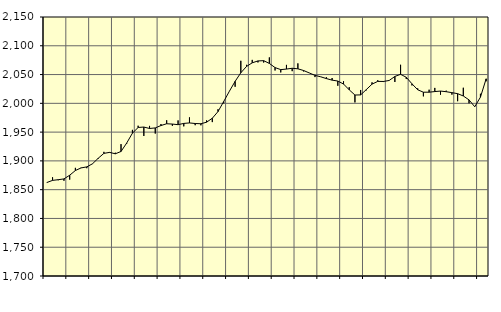
| Category | Piggar | Series 1 |
|---|---|---|
| nan | 1862.1 | 1862.42 |
| 1.0 | 1871.5 | 1866.12 |
| 1.0 | 1866.4 | 1867.33 |
| 1.0 | 1865.5 | 1868.67 |
| nan | 1867.5 | 1875.08 |
| 2.0 | 1887.9 | 1883.27 |
| 2.0 | 1888.2 | 1887.79 |
| 2.0 | 1887.3 | 1889.59 |
| nan | 1894.6 | 1894.94 |
| 3.0 | 1903.5 | 1904.54 |
| 3.0 | 1915.7 | 1913.06 |
| 3.0 | 1915.4 | 1914.78 |
| nan | 1914.2 | 1912.31 |
| 4.0 | 1929.1 | 1916.35 |
| 4.0 | 1930 | 1931.1 |
| 4.0 | 1953.9 | 1948.16 |
| nan | 1961.1 | 1958.06 |
| 5.0 | 1943.3 | 1958.8 |
| 5.0 | 1960.8 | 1956.31 |
| 5.0 | 1947.5 | 1957.27 |
| nan | 1964 | 1961.42 |
| 6.0 | 1970.6 | 1964.5 |
| 6.0 | 1960.9 | 1963.97 |
| 6.0 | 1970.3 | 1962.91 |
| nan | 1960 | 1965.12 |
| 7.0 | 1975.6 | 1965.96 |
| 7.0 | 1962 | 1964.94 |
| 7.0 | 1961.8 | 1964.55 |
| nan | 1970.4 | 1967.24 |
| 8.0 | 1967.4 | 1974.1 |
| 8.0 | 1989.7 | 1985.68 |
| 8.0 | 2000 | 2003.14 |
| nan | 2021 | 2021.08 |
| 9.0 | 2028.8 | 2038.2 |
| 9.0 | 2073.9 | 2053.06 |
| 9.0 | 2066.9 | 2064.12 |
| nan | 2075.5 | 2070.4 |
| 10.0 | 2071.1 | 2073.68 |
| 10.0 | 2070.9 | 2074.13 |
| 10.0 | 2079.8 | 2069.34 |
| nan | 2057.1 | 2062.11 |
| 11.0 | 2053.7 | 2058.58 |
| 11.0 | 2066.8 | 2059.53 |
| 11.0 | 2055.9 | 2060.95 |
| nan | 2069.4 | 2059.96 |
| 12.0 | 2055.4 | 2057.03 |
| 12.0 | 2052.9 | 2052.78 |
| 12.0 | 2045.6 | 2048.58 |
| nan | 2046 | 2046.13 |
| 13.0 | 2045.3 | 2043 |
| 13.0 | 2044 | 2040.29 |
| 13.0 | 2030.5 | 2038.73 |
| nan | 2038.4 | 2033.56 |
| 14.0 | 2028.1 | 2023.49 |
| 14.0 | 2001.6 | 2014.43 |
| 14.0 | 2023.2 | 2014.65 |
| nan | 2022.6 | 2023.91 |
| 15.0 | 2036.5 | 2033.39 |
| 15.0 | 2040.2 | 2038.12 |
| 15.0 | 2037 | 2037.99 |
| nan | 2039.9 | 2039.7 |
| 16.0 | 2037.1 | 2046.7 |
| 16.0 | 2067 | 2050.45 |
| 16.0 | 2042.2 | 2045.26 |
| nan | 2031.1 | 2033.92 |
| 17.0 | 2026 | 2023.6 |
| 17.0 | 2012.1 | 2019.33 |
| 17.0 | 2023.7 | 2019.34 |
| nan | 2026.8 | 2020.45 |
| 18.0 | 2015 | 2021.3 |
| 18.0 | 2022 | 2020.18 |
| 18.0 | 2015.1 | 2018.56 |
| nan | 2003.7 | 2016.81 |
| 19.0 | 2027.1 | 2012.76 |
| 19.0 | 2000.1 | 2005.98 |
| 19.0 | 1994.6 | 1994.06 |
| nan | 2016.6 | 2010.75 |
| 20.0 | 2038.3 | 2042.62 |